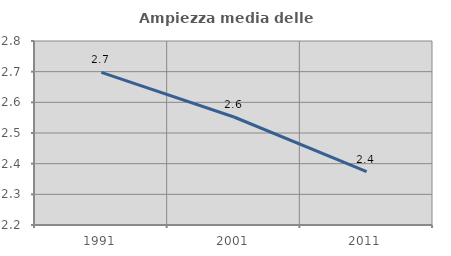
| Category | Ampiezza media delle famiglie |
|---|---|
| 1991.0 | 2.697 |
| 2001.0 | 2.552 |
| 2011.0 | 2.374 |